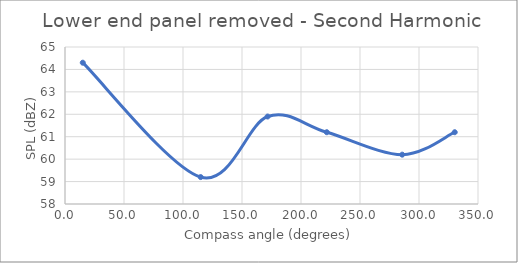
| Category | Series 0 |
|---|---|
| 15.06445125542554 | 64.3 |
| 115.00449447818254 | 59.2 |
| 171.7068171198818 | 61.9 |
| 221.8691292075067 | 61.2 |
| 285.7828166838848 | 60.2 |
| 330.28010595813004 | 61.2 |